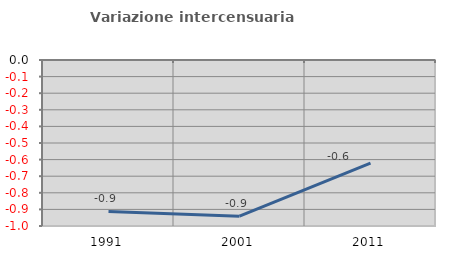
| Category | Variazione intercensuaria annua |
|---|---|
| 1991.0 | -0.913 |
| 2001.0 | -0.941 |
| 2011.0 | -0.621 |